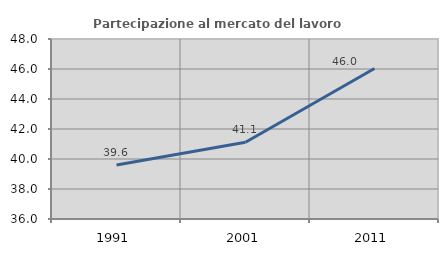
| Category | Partecipazione al mercato del lavoro  femminile |
|---|---|
| 1991.0 | 39.6 |
| 2001.0 | 41.112 |
| 2011.0 | 46.035 |